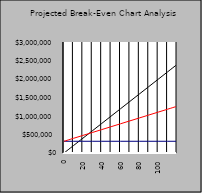
| Category | REVENUE | FIXED COSTS | TOTAL COSTS |
|---|---|---|---|
| 0.0 | 0 | 317133 | 317133 |
| 10.0 | 199316.667 | 317133 | 395883 |
| 20.0 | 398633.333 | 317133 | 474633 |
| 30.0 | 597950 | 317133 | 553383 |
| 40.0 | 797266.667 | 317133 | 632133 |
| 50.0 | 996583.333 | 317133 | 710883 |
| 60.0 | 1195900 | 317133 | 789633 |
| 70.0 | 1395216.667 | 317133 | 868383 |
| 80.0 | 1594533.333 | 317133 | 947133 |
| 90.0 | 1793850 | 317133 | 1025883 |
| 100.0 | 1993166.667 | 317133 | 1104633 |
| 110.0 | 2192483.333 | 317133 | 1183383 |